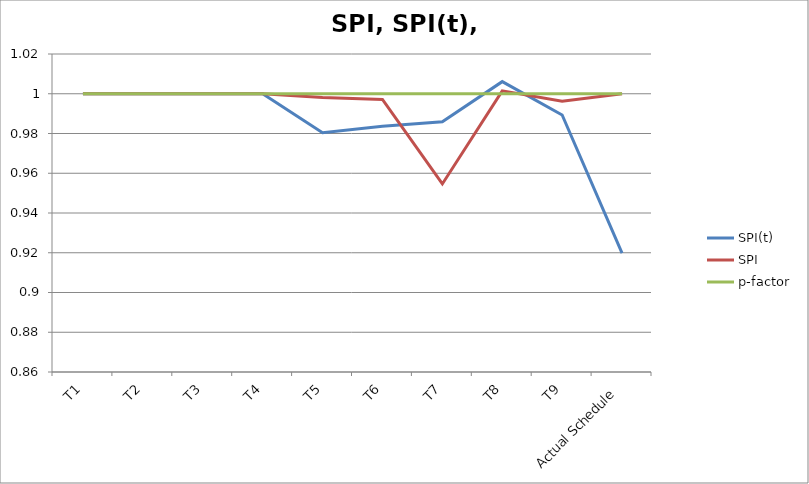
| Category | SPI(t) | SPI | p-factor |
|---|---|---|---|
| T1 | 1 | 1 | 1 |
| T2 | 1 | 1 | 1 |
| T3 | 1 | 1 | 1 |
| T4 | 1 | 1 | 1 |
| T5 | 0.98 | 0.998 | 1 |
| T6 | 0.984 | 0.997 | 1 |
| T7 | 0.986 | 0.955 | 1 |
| T8 | 1.006 | 1.001 | 1 |
| T9 | 0.989 | 0.996 | 1 |
| Actual Schedule | 0.92 | 1 | 1 |